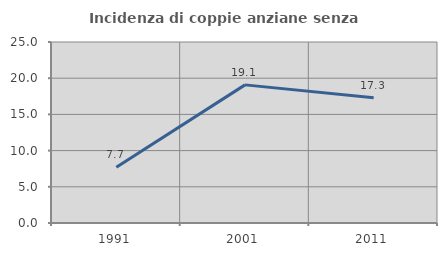
| Category | Incidenza di coppie anziane senza figli  |
|---|---|
| 1991.0 | 7.692 |
| 2001.0 | 19.079 |
| 2011.0 | 17.293 |